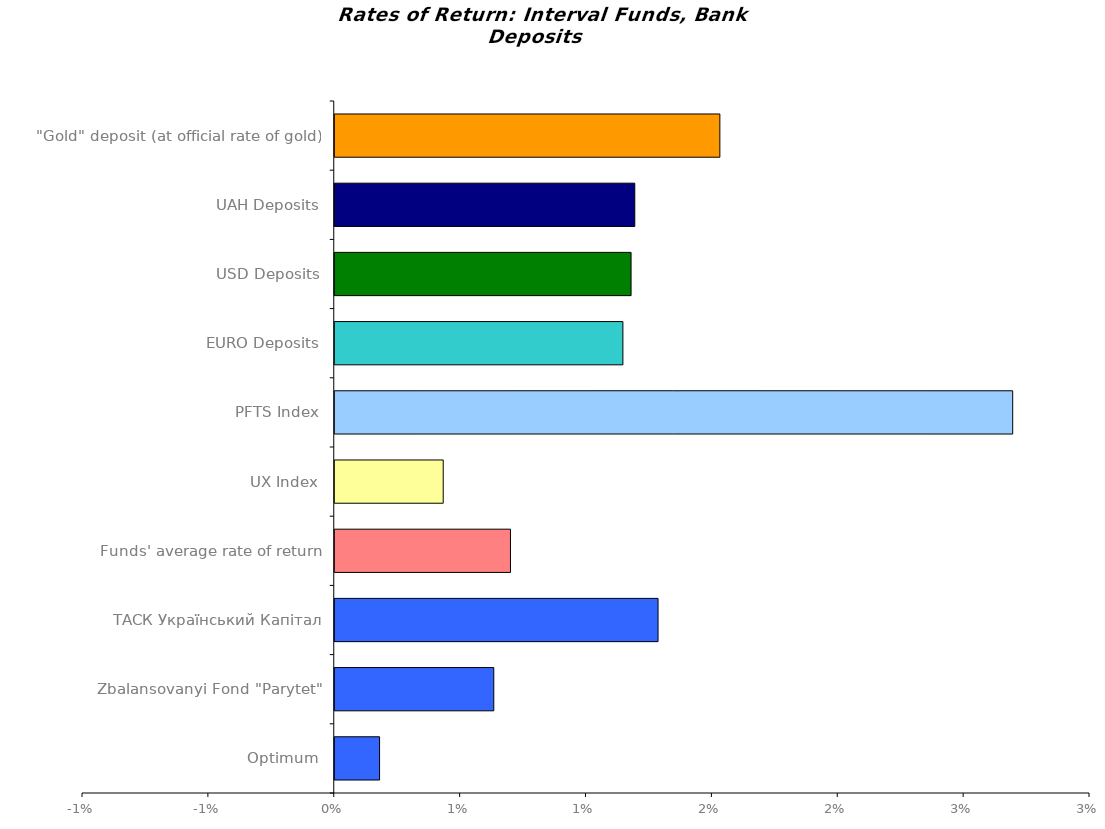
| Category | Series 0 |
|---|---|
| Optimum | 0.002 |
| Zbalansovanyi Fond "Parytet" | 0.006 |
| ТАСК Український Капітал | 0.013 |
| Funds' average rate of return | 0.007 |
| UX Index | 0.004 |
| PFTS Index | 0.027 |
| EURO Deposits | 0.011 |
| USD Deposits | 0.012 |
| UAH Deposits | 0.012 |
| "Gold" deposit (at official rate of gold) | 0.015 |